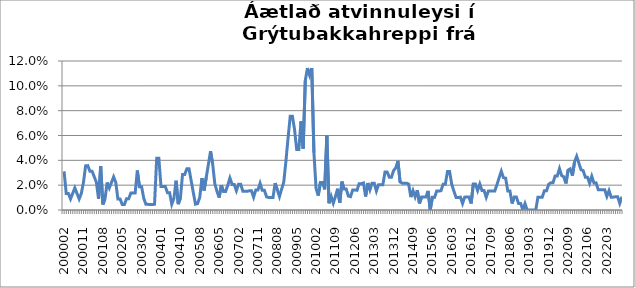
| Category | Series 0 |
|---|---|
| 200002 | 0.031 |
| 200003 | 0.013 |
| 200004 | 0.013 |
| 200005 | 0.009 |
| 200006 | 0.013 |
| 200007 | 0.018 |
| 200008 | 0.013 |
| 200009 | 0.009 |
| 200010 | 0.013 |
| 200011 | 0.022 |
| 200012 | 0.036 |
| 200101 | 0.036 |
| 200102 | 0.031 |
| 200103 | 0.031 |
| 200104 | 0.027 |
| 200105 | 0.022 |
| 200106 | 0.009 |
| 200107 | 0.035 |
| 200108 | 0.004 |
| 200109 | 0.009 |
| 200110 | 0.022 |
| 200111 | 0.018 |
| 200112 | 0.022 |
| 200201 | 0.027 |
| 200202 | 0.022 |
| 200203 | 0.009 |
| 200204 | 0.009 |
| 200205 | 0.004 |
| 200206 | 0.004 |
| 200207 | 0.009 |
| 200208 | 0.009 |
| 200209 | 0.014 |
| 200210 | 0.014 |
| 200211 | 0.014 |
| 200212 | 0.032 |
| 200301 | 0.019 |
| 200302 | 0.019 |
| 200303 | 0.009 |
| 200304 | 0.005 |
| 200305 | 0.005 |
| 200308 | 0.004 |
| 200309 | 0.004 |
| 200310 | 0.005 |
| 200311 | 0.042 |
| 200312 | 0.042 |
| 200401 | 0.019 |
| 200402 | 0.019 |
| 200403 | 0.019 |
| 200404 | 0.014 |
| 200405 | 0.014 |
| 200406 | 0.005 |
| 200407 | 0.009 |
| 200408 | 0.024 |
| 200409 | 0.005 |
| 200410 | 0.01 |
| 200411 | 0.029 |
| 200412 | 0.029 |
| 200501 | 0.033 |
| 200502 | 0.033 |
| 200503 | 0.024 |
| 200504 | 0.014 |
| 200505 | 0.005 |
| 200507 | 0.005 |
| 200508 | 0.01 |
| 200509 | 0.026 |
| 200510 | 0.016 |
| 200511 | 0.026 |
| 200512 | 0.037 |
| 200601 | 0.047 |
| 200602 | 0.037 |
| 200603 | 0.021 |
| 200604 | 0.015 |
| 200605 | 0.01 |
| 200606 | 0.02 |
| 200607 | 0.015 |
| 200608 | 0.015 |
| 200609 | 0.02 |
| 200610 | 0.026 |
| 200611 | 0.021 |
| 200612 | 0.021 |
| 200701 | 0.016 |
| 200702 | 0.021 |
| 200703 | 0.021 |
| 200704 | 0.015 |
| 200705 | 0.015 |
| 200706 | 0.015 |
| 200707 | 0.015 |
| 200708 | 0.015 |
| 200709 | 0.01 |
| 200710 | 0.016 |
| 200711 | 0.016 |
| 200712 | 0.022 |
| 200801 | 0.016 |
| 200802 | 0.016 |
| 200803 | 0.011 |
| 200804 | 0.01 |
| 200805 | 0.01 |
| 200806 | 0.01 |
| 200807 | 0.022 |
| 200808 | 0.016 |
| 200809 | 0.011 |
| 200810 | 0.017 |
| 200811 | 0.022 |
| 200812 | 0.039 |
| 200901 | 0.058 |
| 200902 | 0.076 |
| 200903 | 0.076 |
| 200904 | 0.065 |
| 200905 | 0.049 |
| 200906 | 0.049 |
| 200907 | 0.071 |
| 200908 | 0.049 |
| 200909 | 0.104 |
| 200910 | 0.114 |
| 200911 | 0.109 |
| 200912 | 0.114 |
| 201001 | 0.046 |
| 201002 | 0.017 |
| 201003 | 0.012 |
| 201004 | 0.022 |
| 201005 | 0.022 |
| 201006 | 0.017 |
| 201007 | 0.06 |
| 201008 | 0.005 |
| 201107 | 0.011 |
| 201108 | 0.005 |
| 201109 | 0.011 |
| 201110 | 0.017 |
| 201111 | 0.006 |
| 201112 | 0.023 |
| 201201 | 0.017 |
| 201202 | 0.017 |
| 201203 | 0.011 |
| 201204 | 0.011 |
| 201205 | 0.016 |
| 201206 | 0.016 |
| 201207 | 0.016 |
| 201208 | 0.021 |
| 201209 | 0.021 |
| 201210 | 0.022 |
| 201211 | 0.011 |
| 201212 | 0.022 |
| 201301 | 0.016 |
| 201302 | 0.022 |
| 201303 | 0.022 |
| 201304 | 0.015 |
| 201305 | 0.02 |
| 201306 | 0.02 |
| 201307 | 0.02 |
| 201308 | 0.031 |
| 201309 | 0.031 |
| 201310 | 0.026 |
| 201311 | 0.026 |
| 201312 | 0.032 |
| 201401 | 0.034 |
| 201402 | 0.04 |
| 201403 | 0.023 |
| 201404 | 0.022 |
| 201405 | 0.022 |
| 201406 | 0.022 |
| 201407 | 0.021 |
| 201408 | 0.01 |
| 201409 | 0.016 |
| 201410 | 0.011 |
| 201411 | 0.016 |
| 201412 | 0.005 |
| 201501 | 0.011 |
| 201502 | 0.011 |
| 201503 | 0.011 |
| 201504 | 0.015 |
| 201505 | 0 |
| 201506 | 0.01 |
| 201507 | 0.01 |
| 201508 | 0.015 |
| 201509 | 0.015 |
| 201510 | 0.016 |
| 201511 | 0.021 |
| 201512 | 0.021 |
| 201601 | 0.031 |
| 201602 | 0.031 |
| 201603 | 0.021 |
| 201604 | 0.015 |
| 201605 | 0.01 |
| 201606 | 0.01 |
| 201607 | 0.01 |
| 201608 | 0.005 |
| 201609 | 0.01 |
| 201610 | 0.01 |
| 201611 | 0.01 |
| 201612 | 0.005 |
| 201701 | 0.021 |
| 201702 | 0.021 |
| 201703 | 0.016 |
| 201704 | 0.021 |
| 201705 | 0.016 |
| 201706 | 0.016 |
| 201707 | 0.01 |
| 201708 | 0.015 |
| 201709 | 0.015 |
| 201710 | 0.015 |
| 201711 | 0.015 |
| 201712 | 0.021 |
| 201801 | 0.026 |
| 201802 | 0.031 |
| 201803 | 0.026 |
| 201804 | 0.026 |
| 201805 | 0.015 |
| 201806 | 0.015 |
| 201807 | 0.005 |
| 201808 | 0.011 |
| 201809 | 0.011 |
| 201810 | 0.005 |
| 201811 | 0.005 |
| 201812 | 0 |
| 201901 | 0.005 |
| 201902 | 0 |
| 201903 | 0 |
| 201904 | 0 |
| 201905 | 0 |
| 201906 | 0 |
| 201907 | 0.01 |
| 201908 | 0.01 |
| 201909 | 0.01 |
| 201910 | 0.016 |
| 201911 | 0.016 |
| 201912 | 0.021 |
| 202001 | 0.022 |
| 202002 | 0.022 |
| 202003 | 0.027 |
| 202004 | 0.027 |
| 202005 | 0.033 |
| 202006 | 0.028 |
| 202007 | 0.027 |
| 202008 | 0.021 |
| 202009 | 0.032 |
| 202010 | 0.033 |
| 202011 | 0.028 |
| 202012 | 0.039 |
| 202101 | 0.043 |
| 202102 | 0.038 |
| 202103 | 0.032 |
| 202104 | 0.032 |
| 202105 | 0.026 |
| 202106 | 0.026 |
| 202107 | 0.022 |
| 202108 | 0.027 |
| 202109 | 0.022 |
| 202110 | 0.022 |
| 202111 | 0.016 |
| 202112 | 0.016 |
| 202201 | 0.016 |
| 202202 | 0.016 |
| 202203 | 0.011 |
| 202204 | 0.016 |
| 202205 | 0.01 |
| 202206 | 0.01 |
| 202207 | 0.011 |
| 202208 | 0.011 |
| 202209 | 0.005 |
| 202210 | 0.011 |